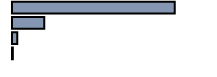
| Category | Series 0 |
|---|---|
| 0 | 80.964 |
| 1 | 16.061 |
| 2 | 2.557 |
| 3 | 0.419 |